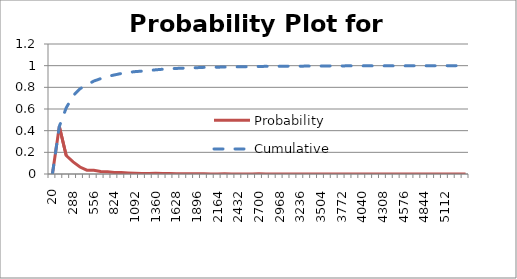
| Category | Probability | Cumulative |
|---|---|---|
| 20.0 | 0.001 | 0.001 |
| 109.33333333333333 | 0.439 | 0.44 |
| 198.66666666666666 | 0.171 | 0.61 |
| 288.0 | 0.112 | 0.722 |
| 377.3333333333333 | 0.065 | 0.787 |
| 466.66666666666663 | 0.036 | 0.822 |
| 556.0 | 0.035 | 0.858 |
| 645.3333333333333 | 0.022 | 0.88 |
| 734.6666666666666 | 0.02 | 0.9 |
| 824.0 | 0.014 | 0.915 |
| 913.3333333333333 | 0.013 | 0.928 |
| 1002.6666666666666 | 0.01 | 0.938 |
| 1092.0 | 0.007 | 0.945 |
| 1181.3333333333333 | 0.005 | 0.95 |
| 1270.6666666666665 | 0.005 | 0.955 |
| 1360.0 | 0.007 | 0.962 |
| 1449.3333333333333 | 0.005 | 0.967 |
| 1538.6666666666665 | 0.005 | 0.972 |
| 1628.0 | 0.003 | 0.975 |
| 1717.3333333333333 | 0.002 | 0.977 |
| 1806.6666666666665 | 0.002 | 0.979 |
| 1896.0 | 0.002 | 0.981 |
| 1985.3333333333333 | 0.003 | 0.984 |
| 2074.6666666666665 | 0.001 | 0.985 |
| 2164.0 | 0.001 | 0.986 |
| 2253.333333333333 | 0.001 | 0.987 |
| 2342.6666666666665 | 0.001 | 0.988 |
| 2432.0 | 0.001 | 0.989 |
| 2521.333333333333 | 0.001 | 0.99 |
| 2610.6666666666665 | 0.001 | 0.991 |
| 2700.0 | 0.002 | 0.993 |
| 2789.333333333333 | 0.001 | 0.994 |
| 2878.6666666666665 | 0.001 | 0.994 |
| 2968.0 | 0 | 0.995 |
| 3057.333333333333 | 0.001 | 0.995 |
| 3146.6666666666665 | 0 | 0.995 |
| 3236.0 | 0 | 0.996 |
| 3325.333333333333 | 0 | 0.996 |
| 3414.6666666666665 | 0.001 | 0.996 |
| 3504.0 | 0.001 | 0.997 |
| 3593.333333333333 | 0 | 0.997 |
| 3682.6666666666665 | 0.001 | 0.998 |
| 3772.0 | 0 | 0.998 |
| 3861.333333333333 | 0.001 | 0.998 |
| 3950.6666666666665 | 0 | 0.999 |
| 4040.0 | 0 | 0.999 |
| 4129.333333333333 | 0 | 0.999 |
| 4218.666666666666 | 0 | 0.999 |
| 4308.0 | 0 | 0.999 |
| 4397.333333333333 | 0 | 0.999 |
| 4486.666666666666 | 0 | 0.999 |
| 4576.0 | 0 | 0.999 |
| 4665.333333333333 | 0 | 0.999 |
| 4754.666666666666 | 0.001 | 0.999 |
| 4844.0 | 0 | 0.999 |
| 4933.333333333333 | 0 | 0.999 |
| 5022.666666666666 | 0 | 0.999 |
| 5112.0 | 0 | 1 |
| 5201.333333333333 | 0 | 1 |
| 5290.666666666666 | 0 | 1 |